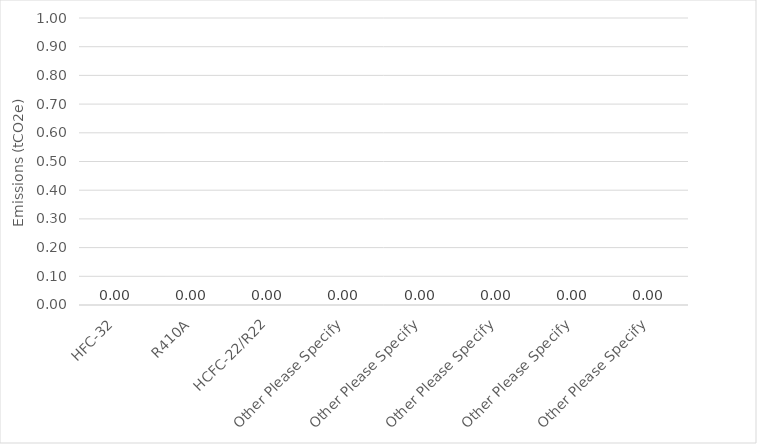
| Category | Emissions
(tCO2e) |
|---|---|
| HFC-32 | 0 |
| R410A | 0 |
| HCFC-22/R22 | 0 |
| Other Please Specify | 0 |
| Other Please Specify | 0 |
| Other Please Specify | 0 |
| Other Please Specify | 0 |
| Other Please Specify | 0 |